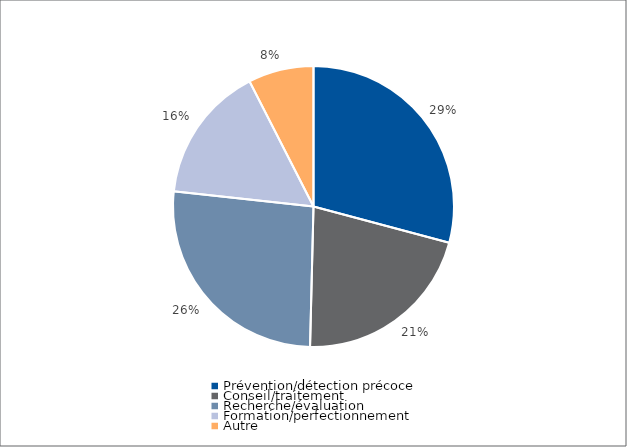
| Category | Series 0 |
|---|---|
| Prévention/détection précoce | 207913 |
| Conseil/traitement | 151376 |
| Recherche/évaluation | 187710 |
| Formation/perfectionnement | 112358 |
| Autre | 53648 |